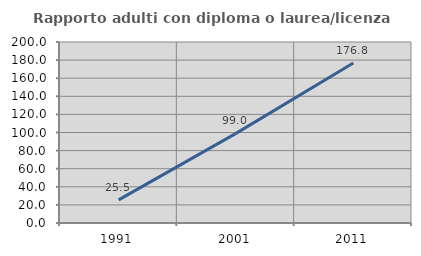
| Category | Rapporto adulti con diploma o laurea/licenza media  |
|---|---|
| 1991.0 | 25.51 |
| 2001.0 | 99.034 |
| 2011.0 | 176.842 |